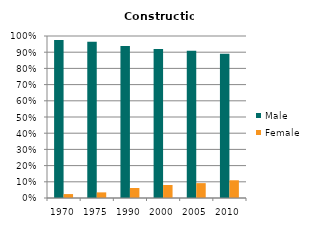
| Category | Male | Female |
|---|---|---|
| 1970.0 | 0.976 | 0.024 |
| 1975.0 | 0.965 | 0.035 |
| 1990.0 | 0.938 | 0.062 |
| 2000.0 | 0.92 | 0.08 |
| 2005.0 | 0.908 | 0.092 |
| 2010.0 | 0.891 | 0.109 |